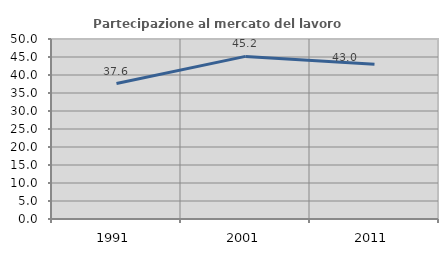
| Category | Partecipazione al mercato del lavoro  femminile |
|---|---|
| 1991.0 | 37.627 |
| 2001.0 | 45.17 |
| 2011.0 | 42.992 |